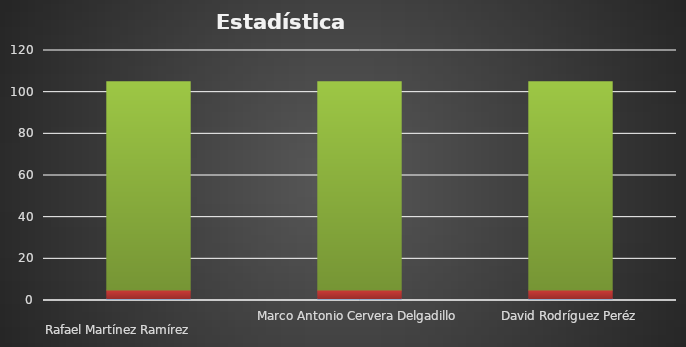
| Category | Series 0 | Series 1 | Series 2 |
|---|---|---|---|
| 
Rafael Martínez Ramírez                                              | 1 | 4 | 100 |
| Marco Antonio Cervera Delgadillo | 1 | 4 | 100 |
| David Rodríguez Peréz | 1 | 4 | 100 |